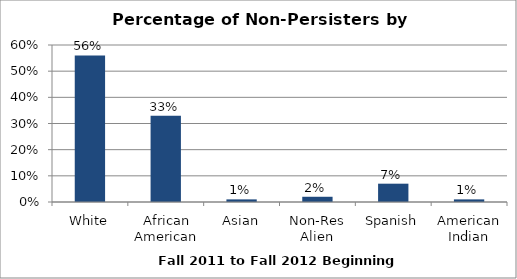
| Category | Series 0 |
|---|---|
| White | 0.56 |
| African American | 0.33 |
| Asian | 0.01 |
| Non-Res Alien | 0.02 |
| Spanish | 0.07 |
| American Indian | 0.01 |